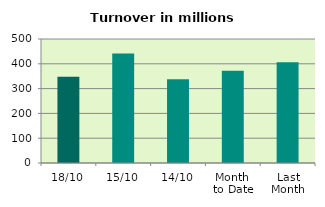
| Category | Series 0 |
|---|---|
| 18/10 | 347.387 |
| 15/10 | 441.919 |
| 14/10 | 337.649 |
| Month 
to Date | 372.028 |
| Last
Month | 405.806 |